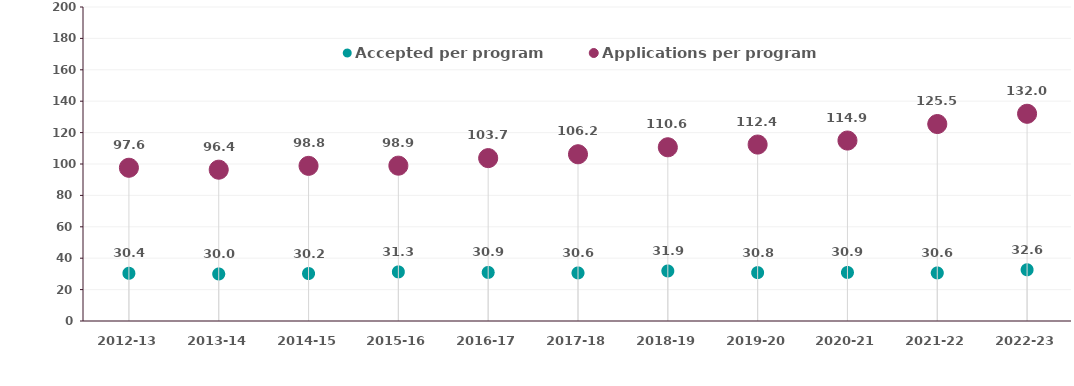
| Category | Accepted per program | Applications per program |
|---|---|---|
| 2012-13 | 30.403 | 97.603 |
| 2013-14 | 29.955 | 96.374 |
| 2014-15 | 30.236 | 98.827 |
| 2015-16 | 31.266 | 98.937 |
| 2016-17 | 30.93 | 103.739 |
| 2017-18 | 30.62 | 106.204 |
| 2018-19 | 31.865 | 110.649 |
| 2019-20 | 30.816 | 112.383 |
| 2020-21 | 30.927 | 114.937 |
| 2021-22 | 30.613 | 125.451 |
| 2022-23 | 32.632 | 131.988 |